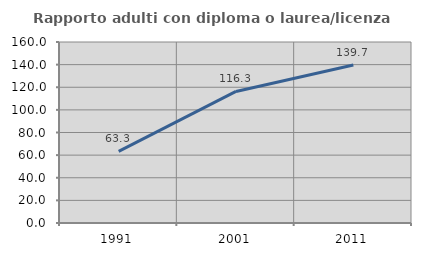
| Category | Rapporto adulti con diploma o laurea/licenza media  |
|---|---|
| 1991.0 | 63.273 |
| 2001.0 | 116.301 |
| 2011.0 | 139.702 |